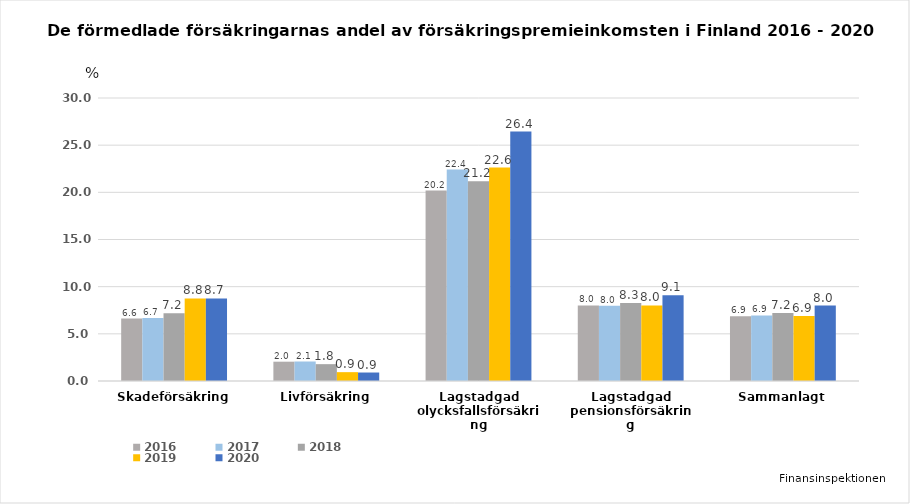
| Category | 2016 | 2017 | 2018 | 2019 | 2020 |
|---|---|---|---|---|---|
| Skadeförsäkring | 6.621 | 6.681 | 7.184 | 8.751 | 8.75 |
| Livförsäkring | 2.047 | 2.067 | 1.786 | 0.938 | 0.899 |
| Lagstadgad olycksfallsförsäkring | 20.194 | 22.408 | 21.186 | 22.632 | 26.436 |
| Lagstadgad pensionsförsäkring | 8.016 | 7.982 | 8.268 | 8.015 | 9.101 |
| Sammanlagt | 6.875 | 6.948 | 7.208 | 6.878 | 8 |